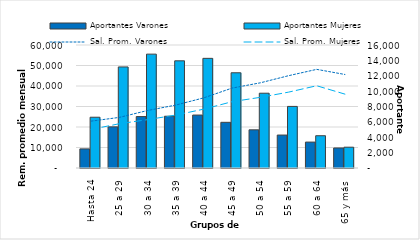
| Category | Aportantes Varones | Aportantes Mujeres |
|---|---|---|
| Hasta 24 | 2484 | 6604 |
| 25 a 29 | 5353 | 13148 |
| 30 a 34 | 6690 | 14812 |
| 35 a 39 | 6735 | 13943 |
| 40 a 44 | 6887 | 14264 |
| 45 a 49 | 5943 | 12388 |
| 50 a 54 | 4967 | 9729 |
| 55 a 59 | 4286 | 8011 |
| 60 a 64 | 3371 | 4198 |
| 65 y más | 2604 | 2707 |